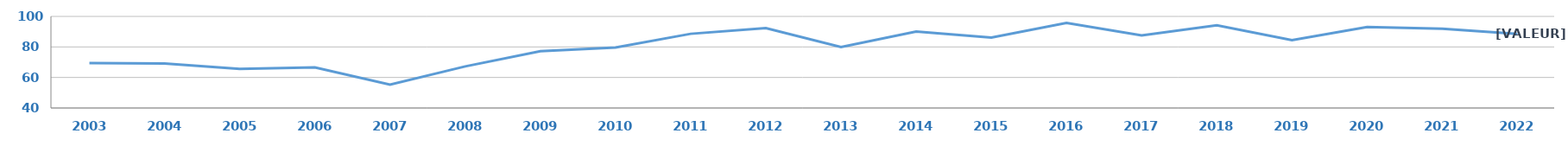
| Category | CFG |
|---|---|
| 2003.0 | 69.388 |
| 2004.0 | 69.159 |
| 2005.0 | 65.603 |
| 2006.0 | 66.547 |
| 2007.0 | 55.33 |
| 2008.0 | 67.241 |
| 2009.0 | 77.248 |
| 2010.0 | 79.57 |
| 2011.0 | 88.612 |
| 2012.0 | 92.308 |
| 2013.0 | 79.932 |
| 2014.0 | 90.122 |
| 2015.0 | 86.169 |
| 2016.0 | 95.789 |
| 2017.0 | 87.6 |
| 2018.0 | 94.2 |
| 2019.0 | 84.4 |
| 2020.0 | 93.1 |
| 2021.0 | 91.9 |
| 2022.0 | 88.6 |